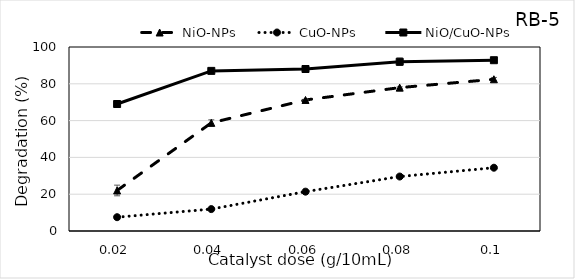
| Category | NiO-NPs | CuO-NPs  | NiO/CuO-NPs |
|---|---|---|---|
| 0.02 | 22.023 | 7.5 | 69.02 |
| 0.04 | 58.767 | 11.91 | 87.02 |
| 0.06 | 71.214 | 21.38 | 88.039 |
| 0.08 | 77.919 | 29.6 | 91.98 |
| 0.1 | 82.466 | 34.39 | 92.824 |